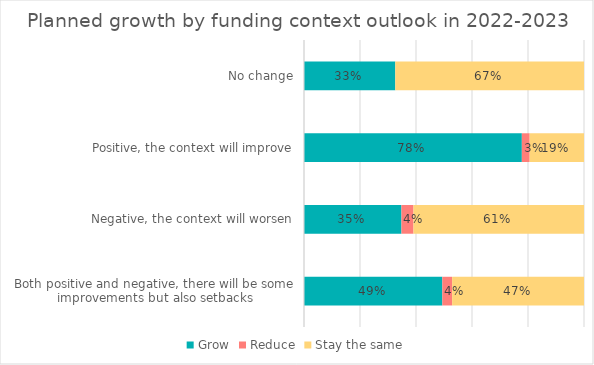
| Category | Grow | Reduce | Stay the same |
|---|---|---|---|
| No change | 32.6 | 0 | 67.4 |
| Positive, the context will improve | 77.8 | 2.8 | 19.4 |
| Negative, the context will worsen | 34.8 | 4.3 | 60.9 |
| Both positive and negative, there will be some improvements but also setbacks | 49.4 | 3.5 | 47.1 |